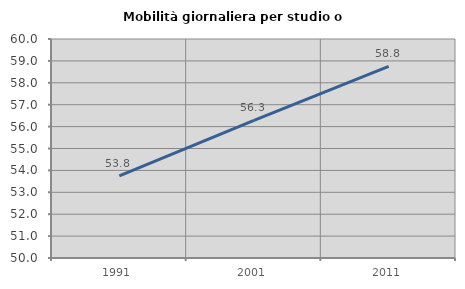
| Category | Mobilità giornaliera per studio o lavoro |
|---|---|
| 1991.0 | 53.75 |
| 2001.0 | 56.287 |
| 2011.0 | 58.75 |